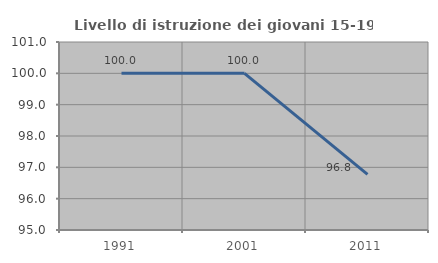
| Category | Livello di istruzione dei giovani 15-19 anni |
|---|---|
| 1991.0 | 100 |
| 2001.0 | 100 |
| 2011.0 | 96.774 |